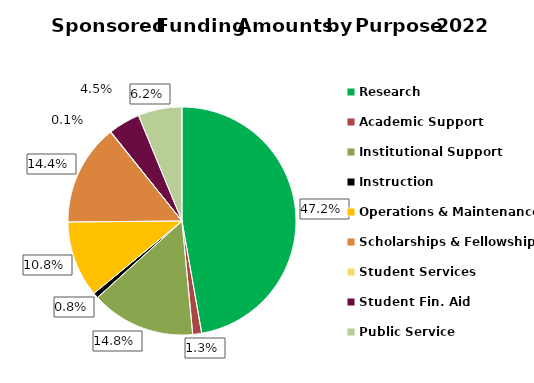
| Category | Series 0 |
|---|---|
| Research | 284205 |
| Academic Support | 7619 |
| Institutional Support | 88983 |
| Instruction | 4599 |
| Operations & Maintenance | 65053 |
| Scholarships & Fellowships | 86371 |
| Student Services | 415 |
| Student Fin. Aid | 27031 |
| Public Service | 37466 |